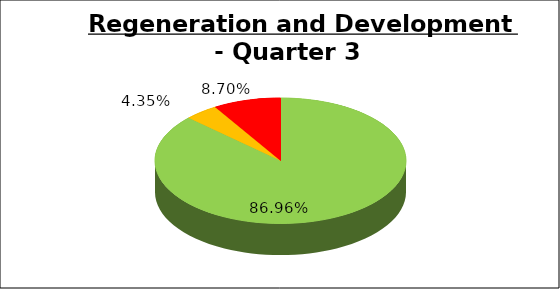
| Category | Q3 |
|---|---|
| Green | 0.87 |
| Amber | 0.043 |
| Red | 0.087 |